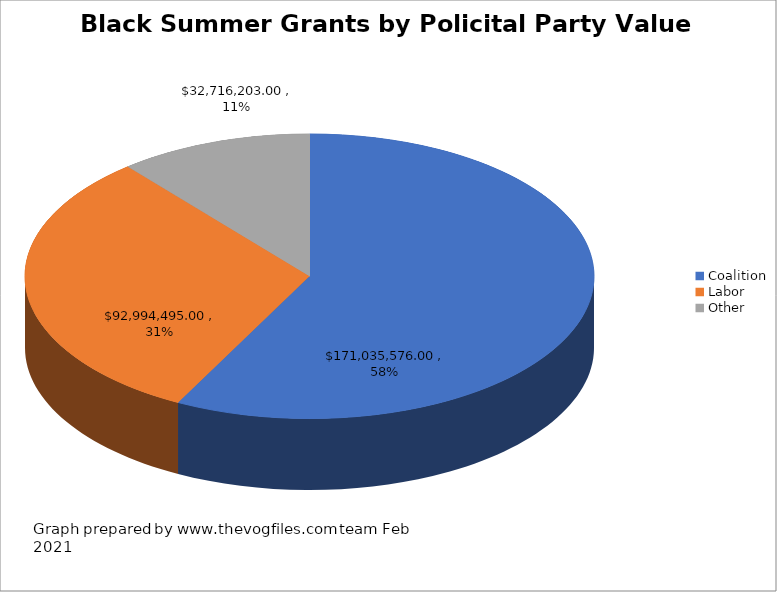
| Category | Black Summer Grants by Policital Party Value $296,746,274.00 |
|---|---|
| Coalition | 171035576 |
| Labor | 92994495 |
| Other | 32716203 |